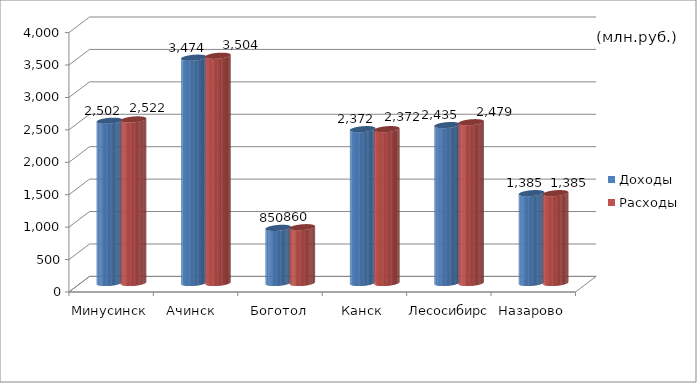
| Category | Доходы | Расходы |
|---|---|---|
| Минусинск | 2502 | 2522 |
| Ачинск  | 3474 | 3504 |
| Боготол | 850 | 860 |
| Канск | 2372 | 2372 |
| Лесосибирск | 2435 | 2479 |
| Назарово | 1385 | 1385 |